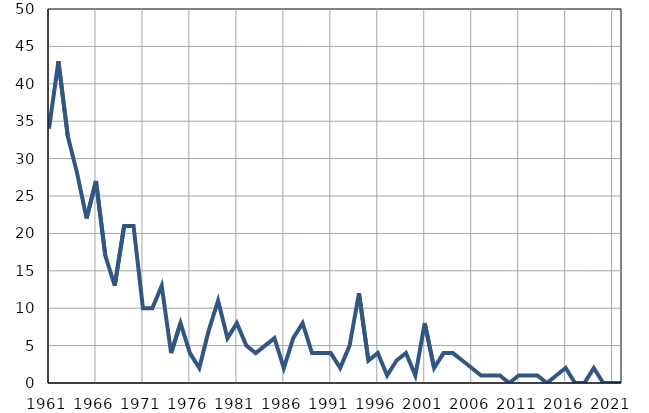
| Category | Умрла 
одојчад |
|---|---|
| 1961.0 | 34 |
| 1962.0 | 43 |
| 1963.0 | 33 |
| 1964.0 | 28 |
| 1965.0 | 22 |
| 1966.0 | 27 |
| 1967.0 | 17 |
| 1968.0 | 13 |
| 1969.0 | 21 |
| 1970.0 | 21 |
| 1971.0 | 10 |
| 1972.0 | 10 |
| 1973.0 | 13 |
| 1974.0 | 4 |
| 1975.0 | 8 |
| 1976.0 | 4 |
| 1977.0 | 2 |
| 1978.0 | 7 |
| 1979.0 | 11 |
| 1980.0 | 6 |
| 1981.0 | 8 |
| 1982.0 | 5 |
| 1983.0 | 4 |
| 1984.0 | 5 |
| 1985.0 | 6 |
| 1986.0 | 2 |
| 1987.0 | 6 |
| 1988.0 | 8 |
| 1989.0 | 4 |
| 1990.0 | 4 |
| 1991.0 | 4 |
| 1992.0 | 2 |
| 1993.0 | 5 |
| 1994.0 | 12 |
| 1995.0 | 3 |
| 1996.0 | 4 |
| 1997.0 | 1 |
| 1998.0 | 3 |
| 1999.0 | 4 |
| 2000.0 | 1 |
| 2001.0 | 8 |
| 2002.0 | 2 |
| 2003.0 | 4 |
| 2004.0 | 4 |
| 2005.0 | 3 |
| 2006.0 | 2 |
| 2007.0 | 1 |
| 2008.0 | 1 |
| 2009.0 | 1 |
| 2010.0 | 0 |
| 2011.0 | 1 |
| 2012.0 | 1 |
| 2013.0 | 1 |
| 2014.0 | 0 |
| 2015.0 | 1 |
| 2016.0 | 2 |
| 2017.0 | 0 |
| 2018.0 | 0 |
| 2019.0 | 2 |
| 2020.0 | 0 |
| 2021.0 | 0 |
| 2022.0 | 0 |